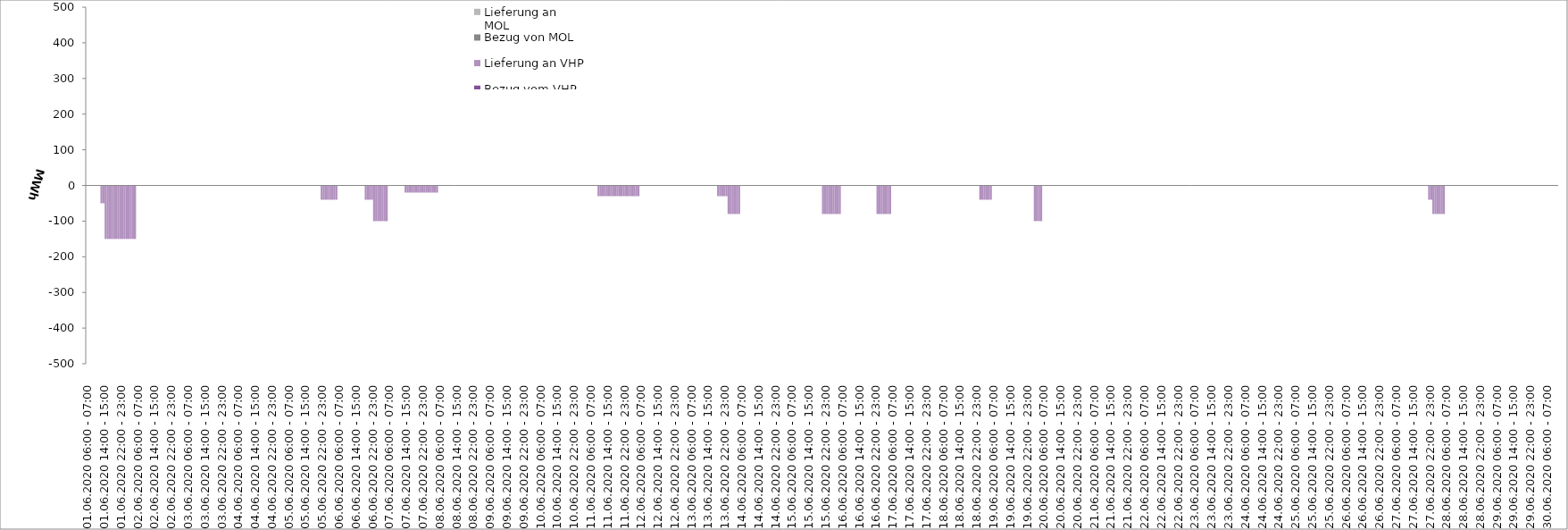
| Category | Bezug vom VHP | Lieferung an VHP | Bezug von MOL | Lieferung an MOL |
|---|---|---|---|---|
| 01.06.2020 06:00 - 07:00 | 0 | 0 | 0 | 0 |
| 01.06.2020 07:00 - 08:00 | 0 | 0 | 0 | 0 |
| 01.06.2020 08:00 - 09:00 | 0 | 0 | 0 | 0 |
| 01.06.2020 09:00 - 10:00 | 0 | 0 | 0 | 0 |
| 01.06.2020 10:00 - 11:00 | 0 | 0 | 0 | 0 |
| 01.06.2020 11:00 - 12:00 | 0 | 0 | 0 | 0 |
| 01.06.2020 12:00 - 13:00 | 0 | 0 | 0 | 0 |
| 01.06.2020 13:00 - 14:00 | 0 | -50 | 0 | 0 |
| 01.06.2020 14:00 - 15:00 | 0 | -50 | 0 | 0 |
| 01.06.2020 15:00 - 16:00 | 0 | -150 | 0 | 0 |
| 01.06.2020 16:00 - 17:00 | 0 | -150 | 0 | 0 |
| 01.06.2020 17:00 - 18:00 | 0 | -150 | 0 | 0 |
| 01.06.2020 18:00 - 19:00 | 0 | -150 | 0 | 0 |
| 01.06.2020 19:00 - 20:00 | 0 | -150 | 0 | 0 |
| 01.06.2020 20:00 - 21:00 | 0 | -150 | 0 | 0 |
| 01.06.2020 21:00 - 22:00 | 0 | -150 | 0 | 0 |
| 01.06.2020 22:00 - 23:00 | 0 | -150 | 0 | 0 |
| 01.06.2020 23:00 - 24:00 | 0 | -150 | 0 | 0 |
| 02.06.2020 00:00 - 01:00 | 0 | -150 | 0 | 0 |
| 02.06.2020 01:00 - 02:00 | 0 | -150 | 0 | 0 |
| 02.06.2020 02:00 - 03:00 | 0 | -150 | 0 | 0 |
| 02.06.2020 03:00 - 04:00 | 0 | -150 | 0 | 0 |
| 02.06.2020 04:00 - 05:00 | 0 | -150 | 0 | 0 |
| 02.06.2020 05:00 - 06:00 | 0 | -150 | 0 | 0 |
| 02.06.2020 06:00 - 07:00 | 0 | 0 | 0 | 0 |
| 02.06.2020 07:00 - 08:00 | 0 | 0 | 0 | 0 |
| 02.06.2020 08:00 - 09:00 | 0 | 0 | 0 | 0 |
| 02.06.2020 09:00 - 10:00 | 0 | 0 | 0 | 0 |
| 02.06.2020 10:00 - 11:00 | 0 | 0 | 0 | 0 |
| 02.06.2020 11:00 - 12:00 | 0 | 0 | 0 | 0 |
| 02.06.2020 12:00 - 13:00 | 0 | 0 | 0 | 0 |
| 02.06.2020 13:00 - 14:00 | 0 | 0 | 0 | 0 |
| 02.06.2020 14:00 - 15:00 | 0 | 0 | 0 | 0 |
| 02.06.2020 15:00 - 16:00 | 0 | 0 | 0 | 0 |
| 02.06.2020 16:00 - 17:00 | 0 | 0 | 0 | 0 |
| 02.06.2020 17:00 - 18:00 | 0 | 0 | 0 | 0 |
| 02.06.2020 18:00 - 19:00 | 0 | 0 | 0 | 0 |
| 02.06.2020 19:00 - 20:00 | 0 | 0 | 0 | 0 |
| 02.06.2020 20:00 - 21:00 | 0 | 0 | 0 | 0 |
| 02.06.2020 21:00 - 22:00 | 0 | 0 | 0 | 0 |
| 02.06.2020 22:00 - 23:00 | 0 | 0 | 0 | 0 |
| 02.06.2020 23:00 - 24:00 | 0 | 0 | 0 | 0 |
| 03.06.2020 00:00 - 01:00 | 0 | 0 | 0 | 0 |
| 03.06.2020 01:00 - 02:00 | 0 | 0 | 0 | 0 |
| 03.06.2020 02:00 - 03:00 | 0 | 0 | 0 | 0 |
| 03.06.2020 03:00 - 04:00 | 0 | 0 | 0 | 0 |
| 03.06.2020 04:00 - 05:00 | 0 | 0 | 0 | 0 |
| 03.06.2020 05:00 - 06:00 | 0 | 0 | 0 | 0 |
| 03.06.2020 06:00 - 07:00 | 0 | 0 | 0 | 0 |
| 03.06.2020 07:00 - 08:00 | 0 | 0 | 0 | 0 |
| 03.06.2020 08:00 - 09:00 | 0 | 0 | 0 | 0 |
| 03.06.2020 09:00 - 10:00 | 0 | 0 | 0 | 0 |
| 03.06.2020 10:00 - 11:00 | 0 | 0 | 0 | 0 |
| 03.06.2020 11:00 - 12:00 | 0 | 0 | 0 | 0 |
| 03.06.2020 12:00 - 13:00 | 0 | 0 | 0 | 0 |
| 03.06.2020 13:00 - 14:00 | 0 | 0 | 0 | 0 |
| 03.06.2020 14:00 - 15:00 | 0 | 0 | 0 | 0 |
| 03.06.2020 15:00 - 16:00 | 0 | 0 | 0 | 0 |
| 03.06.2020 16:00 - 17:00 | 0 | 0 | 0 | 0 |
| 03.06.2020 17:00 - 18:00 | 0 | 0 | 0 | 0 |
| 03.06.2020 18:00 - 19:00 | 0 | 0 | 0 | 0 |
| 03.06.2020 19:00 - 20:00 | 0 | 0 | 0 | 0 |
| 03.06.2020 20:00 - 21:00 | 0 | 0 | 0 | 0 |
| 03.06.2020 21:00 - 22:00 | 0 | 0 | 0 | 0 |
| 03.06.2020 22:00 - 23:00 | 0 | 0 | 0 | 0 |
| 03.06.2020 23:00 - 24:00 | 0 | 0 | 0 | 0 |
| 04.06.2020 00:00 - 01:00 | 0 | 0 | 0 | 0 |
| 04.06.2020 01:00 - 02:00 | 0 | 0 | 0 | 0 |
| 04.06.2020 02:00 - 03:00 | 0 | 0 | 0 | 0 |
| 04.06.2020 03:00 - 04:00 | 0 | 0 | 0 | 0 |
| 04.06.2020 04:00 - 05:00 | 0 | 0 | 0 | 0 |
| 04.06.2020 05:00 - 06:00 | 0 | 0 | 0 | 0 |
| 04.06.2020 06:00 - 07:00 | 0 | 0 | 0 | 0 |
| 04.06.2020 07:00 - 08:00 | 0 | 0 | 0 | 0 |
| 04.06.2020 08:00 - 09:00 | 0 | 0 | 0 | 0 |
| 04.06.2020 09:00 - 10:00 | 0 | 0 | 0 | 0 |
| 04.06.2020 10:00 - 11:00 | 0 | 0 | 0 | 0 |
| 04.06.2020 11:00 - 12:00 | 0 | 0 | 0 | 0 |
| 04.06.2020 12:00 - 13:00 | 0 | 0 | 0 | 0 |
| 04.06.2020 13:00 - 14:00 | 0 | 0 | 0 | 0 |
| 04.06.2020 14:00 - 15:00 | 0 | 0 | 0 | 0 |
| 04.06.2020 15:00 - 16:00 | 0 | 0 | 0 | 0 |
| 04.06.2020 16:00 - 17:00 | 0 | 0 | 0 | 0 |
| 04.06.2020 17:00 - 18:00 | 0 | 0 | 0 | 0 |
| 04.06.2020 18:00 - 19:00 | 0 | 0 | 0 | 0 |
| 04.06.2020 19:00 - 20:00 | 0 | 0 | 0 | 0 |
| 04.06.2020 20:00 - 21:00 | 0 | 0 | 0 | 0 |
| 04.06.2020 21:00 - 22:00 | 0 | 0 | 0 | 0 |
| 04.06.2020 22:00 - 23:00 | 0 | 0 | 0 | 0 |
| 04.06.2020 23:00 - 24:00 | 0 | 0 | 0 | 0 |
| 05.06.2020 00:00 - 01:00 | 0 | 0 | 0 | 0 |
| 05.06.2020 01:00 - 02:00 | 0 | 0 | 0 | 0 |
| 05.06.2020 02:00 - 03:00 | 0 | 0 | 0 | 0 |
| 05.06.2020 03:00 - 04:00 | 0 | 0 | 0 | 0 |
| 05.06.2020 04:00 - 05:00 | 0 | 0 | 0 | 0 |
| 05.06.2020 05:00 - 06:00 | 0 | 0 | 0 | 0 |
| 05.06.2020 06:00 - 07:00 | 0 | 0 | 0 | 0 |
| 05.06.2020 07:00 - 08:00 | 0 | 0 | 0 | 0 |
| 05.06.2020 08:00 - 09:00 | 0 | 0 | 0 | 0 |
| 05.06.2020 09:00 - 10:00 | 0 | 0 | 0 | 0 |
| 05.06.2020 10:00 - 11:00 | 0 | 0 | 0 | 0 |
| 05.06.2020 11:00 - 12:00 | 0 | 0 | 0 | 0 |
| 05.06.2020 12:00 - 13:00 | 0 | 0 | 0 | 0 |
| 05.06.2020 13:00 - 14:00 | 0 | 0 | 0 | 0 |
| 05.06.2020 14:00 - 15:00 | 0 | 0 | 0 | 0 |
| 05.06.2020 15:00 - 16:00 | 0 | 0 | 0 | 0 |
| 05.06.2020 16:00 - 17:00 | 0 | 0 | 0 | 0 |
| 05.06.2020 17:00 - 18:00 | 0 | 0 | 0 | 0 |
| 05.06.2020 18:00 - 19:00 | 0 | 0 | 0 | 0 |
| 05.06.2020 19:00 - 20:00 | 0 | 0 | 0 | 0 |
| 05.06.2020 20:00 - 21:00 | 0 | 0 | 0 | 0 |
| 05.06.2020 21:00 - 22:00 | 0 | 0 | 0 | 0 |
| 05.06.2020 22:00 - 23:00 | 0 | -40 | 0 | 0 |
| 05.06.2020 23:00 - 24:00 | 0 | -40 | 0 | 0 |
| 06.06.2020 00:00 - 01:00 | 0 | -40 | 0 | 0 |
| 06.06.2020 01:00 - 02:00 | 0 | -40 | 0 | 0 |
| 06.06.2020 02:00 - 03:00 | 0 | -40 | 0 | 0 |
| 06.06.2020 03:00 - 04:00 | 0 | -40 | 0 | 0 |
| 06.06.2020 04:00 - 05:00 | 0 | -40 | 0 | 0 |
| 06.06.2020 05:00 - 06:00 | 0 | -40 | 0 | 0 |
| 06.06.2020 06:00 - 07:00 | 0 | 0 | 0 | 0 |
| 06.06.2020 07:00 - 08:00 | 0 | 0 | 0 | 0 |
| 06.06.2020 08:00 - 09:00 | 0 | 0 | 0 | 0 |
| 06.06.2020 09:00 - 10:00 | 0 | 0 | 0 | 0 |
| 06.06.2020 10:00 - 11:00 | 0 | 0 | 0 | 0 |
| 06.06.2020 11:00 - 12:00 | 0 | 0 | 0 | 0 |
| 06.06.2020 12:00 - 13:00 | 0 | 0 | 0 | 0 |
| 06.06.2020 13:00 - 14:00 | 0 | 0 | 0 | 0 |
| 06.06.2020 14:00 - 15:00 | 0 | 0 | 0 | 0 |
| 06.06.2020 15:00 - 16:00 | 0 | 0 | 0 | 0 |
| 06.06.2020 16:00 - 17:00 | 0 | 0 | 0 | 0 |
| 06.06.2020 17:00 - 18:00 | 0 | 0 | 0 | 0 |
| 06.06.2020 18:00 - 19:00 | 0 | 0 | 0 | 0 |
| 06.06.2020 19:00 - 20:00 | 0 | -40 | 0 | 0 |
| 06.06.2020 20:00 - 21:00 | 0 | -40 | 0 | 0 |
| 06.06.2020 21:00 - 22:00 | 0 | -40 | 0 | 0 |
| 06.06.2020 22:00 - 23:00 | 0 | -40 | 0 | 0 |
| 06.06.2020 23:00 - 24:00 | 0 | -100 | 0 | 0 |
| 07.06.2020 00:00 - 01:00 | 0 | -100 | 0 | 0 |
| 07.06.2020 01:00 - 02:00 | 0 | -100 | 0 | 0 |
| 07.06.2020 02:00 - 03:00 | 0 | -100 | 0 | 0 |
| 07.06.2020 03:00 - 04:00 | 0 | -100 | 0 | 0 |
| 07.06.2020 04:00 - 05:00 | 0 | -100 | 0 | 0 |
| 07.06.2020 05:00 - 06:00 | 0 | -100 | 0 | 0 |
| 07.06.2020 06:00 - 07:00 | 0 | 0 | 0 | 0 |
| 07.06.2020 07:00 - 08:00 | 0 | 0 | 0 | 0 |
| 07.06.2020 08:00 - 09:00 | 0 | 0 | 0 | 0 |
| 07.06.2020 09:00 - 10:00 | 0 | 0 | 0 | 0 |
| 07.06.2020 10:00 - 11:00 | 0 | 0 | 0 | 0 |
| 07.06.2020 11:00 - 12:00 | 0 | 0 | 0 | 0 |
| 07.06.2020 12:00 - 13:00 | 0 | 0 | 0 | 0 |
| 07.06.2020 13:00 - 14:00 | 0 | 0 | 0 | 0 |
| 07.06.2020 14:00 - 15:00 | 0 | -20 | 0 | 0 |
| 07.06.2020 15:00 - 16:00 | 0 | -20 | 0 | 0 |
| 07.06.2020 16:00 - 17:00 | 0 | -20 | 0 | 0 |
| 07.06.2020 17:00 - 18:00 | 0 | -20 | 0 | 0 |
| 07.06.2020 18:00 - 19:00 | 0 | -20 | 0 | 0 |
| 07.06.2020 19:00 - 20:00 | 0 | -20 | 0 | 0 |
| 07.06.2020 20:00 - 21:00 | 0 | -20 | 0 | 0 |
| 07.06.2020 21:00 - 22:00 | 0 | -20 | 0 | 0 |
| 07.06.2020 22:00 - 23:00 | 0 | -20 | 0 | 0 |
| 07.06.2020 23:00 - 24:00 | 0 | -20 | 0 | 0 |
| 08.06.2020 00:00 - 01:00 | 0 | -20 | 0 | 0 |
| 08.06.2020 01:00 - 02:00 | 0 | -20 | 0 | 0 |
| 08.06.2020 02:00 - 03:00 | 0 | -20 | 0 | 0 |
| 08.06.2020 03:00 - 04:00 | 0 | -20 | 0 | 0 |
| 08.06.2020 04:00 - 05:00 | 0 | -20 | 0 | 0 |
| 08.06.2020 05:00 - 06:00 | 0 | -20 | 0 | 0 |
| 08.06.2020 06:00 - 07:00 | 0 | 0 | 0 | 0 |
| 08.06.2020 07:00 - 08:00 | 0 | 0 | 0 | 0 |
| 08.06.2020 08:00 - 09:00 | 0 | 0 | 0 | 0 |
| 08.06.2020 09:00 - 10:00 | 0 | 0 | 0 | 0 |
| 08.06.2020 10:00 - 11:00 | 0 | 0 | 0 | 0 |
| 08.06.2020 11:00 - 12:00 | 0 | 0 | 0 | 0 |
| 08.06.2020 12:00 - 13:00 | 0 | 0 | 0 | 0 |
| 08.06.2020 13:00 - 14:00 | 0 | 0 | 0 | 0 |
| 08.06.2020 14:00 - 15:00 | 0 | 0 | 0 | 0 |
| 08.06.2020 15:00 - 16:00 | 0 | 0 | 0 | 0 |
| 08.06.2020 16:00 - 17:00 | 0 | 0 | 0 | 0 |
| 08.06.2020 17:00 - 18:00 | 0 | 0 | 0 | 0 |
| 08.06.2020 18:00 - 19:00 | 0 | 0 | 0 | 0 |
| 08.06.2020 19:00 - 20:00 | 0 | 0 | 0 | 0 |
| 08.06.2020 20:00 - 21:00 | 0 | 0 | 0 | 0 |
| 08.06.2020 21:00 - 22:00 | 0 | 0 | 0 | 0 |
| 08.06.2020 22:00 - 23:00 | 0 | 0 | 0 | 0 |
| 08.06.2020 23:00 - 24:00 | 0 | 0 | 0 | 0 |
| 09.06.2020 00:00 - 01:00 | 0 | 0 | 0 | 0 |
| 09.06.2020 01:00 - 02:00 | 0 | 0 | 0 | 0 |
| 09.06.2020 02:00 - 03:00 | 0 | 0 | 0 | 0 |
| 09.06.2020 03:00 - 04:00 | 0 | 0 | 0 | 0 |
| 09.06.2020 04:00 - 05:00 | 0 | 0 | 0 | 0 |
| 09.06.2020 05:00 - 06:00 | 0 | 0 | 0 | 0 |
| 09.06.2020 06:00 - 07:00 | 0 | 0 | 0 | 0 |
| 09.06.2020 07:00 - 08:00 | 0 | 0 | 0 | 0 |
| 09.06.2020 08:00 - 09:00 | 0 | 0 | 0 | 0 |
| 09.06.2020 09:00 - 10:00 | 0 | 0 | 0 | 0 |
| 09.06.2020 10:00 - 11:00 | 0 | 0 | 0 | 0 |
| 09.06.2020 11:00 - 12:00 | 0 | 0 | 0 | 0 |
| 09.06.2020 12:00 - 13:00 | 0 | 0 | 0 | 0 |
| 09.06.2020 13:00 - 14:00 | 0 | 0 | 0 | 0 |
| 09.06.2020 14:00 - 15:00 | 0 | 0 | 0 | 0 |
| 09.06.2020 15:00 - 16:00 | 0 | 0 | 0 | 0 |
| 09.06.2020 16:00 - 17:00 | 0 | 0 | 0 | 0 |
| 09.06.2020 17:00 - 18:00 | 0 | 0 | 0 | 0 |
| 09.06.2020 18:00 - 19:00 | 0 | 0 | 0 | 0 |
| 09.06.2020 19:00 - 20:00 | 0 | 0 | 0 | 0 |
| 09.06.2020 20:00 - 21:00 | 0 | 0 | 0 | 0 |
| 09.06.2020 21:00 - 22:00 | 0 | 0 | 0 | 0 |
| 09.06.2020 22:00 - 23:00 | 0 | 0 | 0 | 0 |
| 09.06.2020 23:00 - 24:00 | 0 | 0 | 0 | 0 |
| 10.06.2020 00:00 - 01:00 | 0 | 0 | 0 | 0 |
| 10.06.2020 01:00 - 02:00 | 0 | 0 | 0 | 0 |
| 10.06.2020 02:00 - 03:00 | 0 | 0 | 0 | 0 |
| 10.06.2020 03:00 - 04:00 | 0 | 0 | 0 | 0 |
| 10.06.2020 04:00 - 05:00 | 0 | 0 | 0 | 0 |
| 10.06.2020 05:00 - 06:00 | 0 | 0 | 0 | 0 |
| 10.06.2020 06:00 - 07:00 | 0 | 0 | 0 | 0 |
| 10.06.2020 07:00 - 08:00 | 0 | 0 | 0 | 0 |
| 10.06.2020 08:00 - 09:00 | 0 | 0 | 0 | 0 |
| 10.06.2020 09:00 - 10:00 | 0 | 0 | 0 | 0 |
| 10.06.2020 10:00 - 11:00 | 0 | 0 | 0 | 0 |
| 10.06.2020 11:00 - 12:00 | 0 | 0 | 0 | 0 |
| 10.06.2020 12:00 - 13:00 | 0 | 0 | 0 | 0 |
| 10.06.2020 13:00 - 14:00 | 0 | 0 | 0 | 0 |
| 10.06.2020 14:00 - 15:00 | 0 | 0 | 0 | 0 |
| 10.06.2020 15:00 - 16:00 | 0 | 0 | 0 | 0 |
| 10.06.2020 16:00 - 17:00 | 0 | 0 | 0 | 0 |
| 10.06.2020 17:00 - 18:00 | 0 | 0 | 0 | 0 |
| 10.06.2020 18:00 - 19:00 | 0 | 0 | 0 | 0 |
| 10.06.2020 19:00 - 20:00 | 0 | 0 | 0 | 0 |
| 10.06.2020 20:00 - 21:00 | 0 | 0 | 0 | 0 |
| 10.06.2020 21:00 - 22:00 | 0 | 0 | 0 | 0 |
| 10.06.2020 22:00 - 23:00 | 0 | 0 | 0 | 0 |
| 10.06.2020 23:00 - 24:00 | 0 | 0 | 0 | 0 |
| 11.06.2020 00:00 - 01:00 | 0 | 0 | 0 | 0 |
| 11.06.2020 01:00 - 02:00 | 0 | 0 | 0 | 0 |
| 11.06.2020 02:00 - 03:00 | 0 | 0 | 0 | 0 |
| 11.06.2020 03:00 - 04:00 | 0 | 0 | 0 | 0 |
| 11.06.2020 04:00 - 05:00 | 0 | 0 | 0 | 0 |
| 11.06.2020 05:00 - 06:00 | 0 | 0 | 0 | 0 |
| 11.06.2020 06:00 - 07:00 | 0 | 0 | 0 | 0 |
| 11.06.2020 07:00 - 08:00 | 0 | 0 | 0 | 0 |
| 11.06.2020 08:00 - 09:00 | 0 | 0 | 0 | 0 |
| 11.06.2020 09:00 - 10:00 | 0 | 0 | 0 | 0 |
| 11.06.2020 10:00 - 11:00 | 0 | -30 | 0 | 0 |
| 11.06.2020 11:00 - 12:00 | 0 | -30 | 0 | 0 |
| 11.06.2020 12:00 - 13:00 | 0 | -30 | 0 | 0 |
| 11.06.2020 13:00 - 14:00 | 0 | -30 | 0 | 0 |
| 11.06.2020 14:00 - 15:00 | 0 | -30 | 0 | 0 |
| 11.06.2020 15:00 - 16:00 | 0 | -30 | 0 | 0 |
| 11.06.2020 16:00 - 17:00 | 0 | -30 | 0 | 0 |
| 11.06.2020 17:00 - 18:00 | 0 | -30 | 0 | 0 |
| 11.06.2020 18:00 - 19:00 | 0 | -30 | 0 | 0 |
| 11.06.2020 19:00 - 20:00 | 0 | -30 | 0 | 0 |
| 11.06.2020 20:00 - 21:00 | 0 | -30 | 0 | 0 |
| 11.06.2020 21:00 - 22:00 | 0 | -30 | 0 | 0 |
| 11.06.2020 22:00 - 23:00 | 0 | -30 | 0 | 0 |
| 11.06.2020 23:00 - 24:00 | 0 | -30 | 0 | 0 |
| 12.06.2020 00:00 - 01:00 | 0 | -30 | 0 | 0 |
| 12.06.2020 01:00 - 02:00 | 0 | -30 | 0 | 0 |
| 12.06.2020 02:00 - 03:00 | 0 | -30 | 0 | 0 |
| 12.06.2020 03:00 - 04:00 | 0 | -30 | 0 | 0 |
| 12.06.2020 04:00 - 05:00 | 0 | -30 | 0 | 0 |
| 12.06.2020 05:00 - 06:00 | 0 | -30 | 0 | 0 |
| 12.06.2020 06:00 - 07:00 | 0 | 0 | 0 | 0 |
| 12.06.2020 07:00 - 08:00 | 0 | 0 | 0 | 0 |
| 12.06.2020 08:00 - 09:00 | 0 | 0 | 0 | 0 |
| 12.06.2020 09:00 - 10:00 | 0 | 0 | 0 | 0 |
| 12.06.2020 10:00 - 11:00 | 0 | 0 | 0 | 0 |
| 12.06.2020 11:00 - 12:00 | 0 | 0 | 0 | 0 |
| 12.06.2020 12:00 - 13:00 | 0 | 0 | 0 | 0 |
| 12.06.2020 13:00 - 14:00 | 0 | 0 | 0 | 0 |
| 12.06.2020 14:00 - 15:00 | 0 | 0 | 0 | 0 |
| 12.06.2020 15:00 - 16:00 | 0 | 0 | 0 | 0 |
| 12.06.2020 16:00 - 17:00 | 0 | 0 | 0 | 0 |
| 12.06.2020 17:00 - 18:00 | 0 | 0 | 0 | 0 |
| 12.06.2020 18:00 - 19:00 | 0 | 0 | 0 | 0 |
| 12.06.2020 19:00 - 20:00 | 0 | 0 | 0 | 0 |
| 12.06.2020 20:00 - 21:00 | 0 | 0 | 0 | 0 |
| 12.06.2020 21:00 - 22:00 | 0 | 0 | 0 | 0 |
| 12.06.2020 22:00 - 23:00 | 0 | 0 | 0 | 0 |
| 12.06.2020 23:00 - 24:00 | 0 | 0 | 0 | 0 |
| 13.06.2020 00:00 - 01:00 | 0 | 0 | 0 | 0 |
| 13.06.2020 01:00 - 02:00 | 0 | 0 | 0 | 0 |
| 13.06.2020 02:00 - 03:00 | 0 | 0 | 0 | 0 |
| 13.06.2020 03:00 - 04:00 | 0 | 0 | 0 | 0 |
| 13.06.2020 04:00 - 05:00 | 0 | 0 | 0 | 0 |
| 13.06.2020 05:00 - 06:00 | 0 | 0 | 0 | 0 |
| 13.06.2020 06:00 - 07:00 | 0 | 0 | 0 | 0 |
| 13.06.2020 07:00 - 08:00 | 0 | 0 | 0 | 0 |
| 13.06.2020 08:00 - 09:00 | 0 | 0 | 0 | 0 |
| 13.06.2020 09:00 - 10:00 | 0 | 0 | 0 | 0 |
| 13.06.2020 10:00 - 11:00 | 0 | 0 | 0 | 0 |
| 13.06.2020 11:00 - 12:00 | 0 | 0 | 0 | 0 |
| 13.06.2020 12:00 - 13:00 | 0 | 0 | 0 | 0 |
| 13.06.2020 13:00 - 14:00 | 0 | 0 | 0 | 0 |
| 13.06.2020 14:00 - 15:00 | 0 | 0 | 0 | 0 |
| 13.06.2020 15:00 - 16:00 | 0 | 0 | 0 | 0 |
| 13.06.2020 16:00 - 17:00 | 0 | 0 | 0 | 0 |
| 13.06.2020 17:00 - 18:00 | 0 | 0 | 0 | 0 |
| 13.06.2020 18:00 - 19:00 | 0 | 0 | 0 | 0 |
| 13.06.2020 19:00 - 20:00 | 0 | -30 | 0 | 0 |
| 13.06.2020 20:00 - 21:00 | 0 | -30 | 0 | 0 |
| 13.06.2020 21:00 - 22:00 | 0 | -30 | 0 | 0 |
| 13.06.2020 22:00 - 23:00 | 0 | -30 | 0 | 0 |
| 13.06.2020 23:00 - 24:00 | 0 | -30 | 0 | 0 |
| 14.06.2020 00:00 - 01:00 | 0 | -80 | 0 | 0 |
| 14.06.2020 01:00 - 02:00 | 0 | -80 | 0 | 0 |
| 14.06.2020 02:00 - 03:00 | 0 | -80 | 0 | 0 |
| 14.06.2020 03:00 - 04:00 | 0 | -80 | 0 | 0 |
| 14.06.2020 04:00 - 05:00 | 0 | -80 | 0 | 0 |
| 14.06.2020 05:00 - 06:00 | 0 | -80 | 0 | 0 |
| 14.06.2020 06:00 - 07:00 | 0 | 0 | 0 | 0 |
| 14.06.2020 07:00 - 08:00 | 0 | 0 | 0 | 0 |
| 14.06.2020 08:00 - 09:00 | 0 | 0 | 0 | 0 |
| 14.06.2020 09:00 - 10:00 | 0 | 0 | 0 | 0 |
| 14.06.2020 10:00 - 11:00 | 0 | 0 | 0 | 0 |
| 14.06.2020 11:00 - 12:00 | 0 | 0 | 0 | 0 |
| 14.06.2020 12:00 - 13:00 | 0 | 0 | 0 | 0 |
| 14.06.2020 13:00 - 14:00 | 0 | 0 | 0 | 0 |
| 14.06.2020 14:00 - 15:00 | 0 | 0 | 0 | 0 |
| 14.06.2020 15:00 - 16:00 | 0 | 0 | 0 | 0 |
| 14.06.2020 16:00 - 17:00 | 0 | 0 | 0 | 0 |
| 14.06.2020 17:00 - 18:00 | 0 | 0 | 0 | 0 |
| 14.06.2020 18:00 - 19:00 | 0 | 0 | 0 | 0 |
| 14.06.2020 19:00 - 20:00 | 0 | 0 | 0 | 0 |
| 14.06.2020 20:00 - 21:00 | 0 | 0 | 0 | 0 |
| 14.06.2020 21:00 - 22:00 | 0 | 0 | 0 | 0 |
| 14.06.2020 22:00 - 23:00 | 0 | 0 | 0 | 0 |
| 14.06.2020 23:00 - 24:00 | 0 | 0 | 0 | 0 |
| 15.06.2020 00:00 - 01:00 | 0 | 0 | 0 | 0 |
| 15.06.2020 01:00 - 02:00 | 0 | 0 | 0 | 0 |
| 15.06.2020 02:00 - 03:00 | 0 | 0 | 0 | 0 |
| 15.06.2020 03:00 - 04:00 | 0 | 0 | 0 | 0 |
| 15.06.2020 04:00 - 05:00 | 0 | 0 | 0 | 0 |
| 15.06.2020 05:00 - 06:00 | 0 | 0 | 0 | 0 |
| 15.06.2020 06:00 - 07:00 | 0 | 0 | 0 | 0 |
| 15.06.2020 07:00 - 08:00 | 0 | 0 | 0 | 0 |
| 15.06.2020 08:00 - 09:00 | 0 | 0 | 0 | 0 |
| 15.06.2020 09:00 - 10:00 | 0 | 0 | 0 | 0 |
| 15.06.2020 10:00 - 11:00 | 0 | 0 | 0 | 0 |
| 15.06.2020 11:00 - 12:00 | 0 | 0 | 0 | 0 |
| 15.06.2020 12:00 - 13:00 | 0 | 0 | 0 | 0 |
| 15.06.2020 13:00 - 14:00 | 0 | 0 | 0 | 0 |
| 15.06.2020 14:00 - 15:00 | 0 | 0 | 0 | 0 |
| 15.06.2020 15:00 - 16:00 | 0 | 0 | 0 | 0 |
| 15.06.2020 16:00 - 17:00 | 0 | 0 | 0 | 0 |
| 15.06.2020 17:00 - 18:00 | 0 | 0 | 0 | 0 |
| 15.06.2020 18:00 - 19:00 | 0 | 0 | 0 | 0 |
| 15.06.2020 19:00 - 20:00 | 0 | 0 | 0 | 0 |
| 15.06.2020 20:00 - 21:00 | 0 | 0 | 0 | 0 |
| 15.06.2020 21:00 - 22:00 | 0 | -80 | 0 | 0 |
| 15.06.2020 22:00 - 23:00 | 0 | -80 | 0 | 0 |
| 15.06.2020 23:00 - 24:00 | 0 | -80 | 0 | 0 |
| 16.06.2020 00:00 - 01:00 | 0 | -80 | 0 | 0 |
| 16.06.2020 01:00 - 02:00 | 0 | -80 | 0 | 0 |
| 16.06.2020 02:00 - 03:00 | 0 | -80 | 0 | 0 |
| 16.06.2020 03:00 - 04:00 | 0 | -80 | 0 | 0 |
| 16.06.2020 04:00 - 05:00 | 0 | -80 | 0 | 0 |
| 16.06.2020 05:00 - 06:00 | 0 | -80 | 0 | 0 |
| 16.06.2020 06:00 - 07:00 | 0 | 0 | 0 | 0 |
| 16.06.2020 07:00 - 08:00 | 0 | 0 | 0 | 0 |
| 16.06.2020 08:00 - 09:00 | 0 | 0 | 0 | 0 |
| 16.06.2020 09:00 - 10:00 | 0 | 0 | 0 | 0 |
| 16.06.2020 10:00 - 11:00 | 0 | 0 | 0 | 0 |
| 16.06.2020 11:00 - 12:00 | 0 | 0 | 0 | 0 |
| 16.06.2020 12:00 - 13:00 | 0 | 0 | 0 | 0 |
| 16.06.2020 13:00 - 14:00 | 0 | 0 | 0 | 0 |
| 16.06.2020 14:00 - 15:00 | 0 | 0 | 0 | 0 |
| 16.06.2020 15:00 - 16:00 | 0 | 0 | 0 | 0 |
| 16.06.2020 16:00 - 17:00 | 0 | 0 | 0 | 0 |
| 16.06.2020 17:00 - 18:00 | 0 | 0 | 0 | 0 |
| 16.06.2020 18:00 - 19:00 | 0 | 0 | 0 | 0 |
| 16.06.2020 19:00 - 20:00 | 0 | 0 | 0 | 0 |
| 16.06.2020 20:00 - 21:00 | 0 | 0 | 0 | 0 |
| 16.06.2020 21:00 - 22:00 | 0 | 0 | 0 | 0 |
| 16.06.2020 22:00 - 23:00 | 0 | 0 | 0 | 0 |
| 16.06.2020 23:00 - 24:00 | 0 | -80 | 0 | 0 |
| 17.06.2020 00:00 - 01:00 | 0 | -80 | 0 | 0 |
| 17.06.2020 01:00 - 02:00 | 0 | -80 | 0 | 0 |
| 17.06.2020 02:00 - 03:00 | 0 | -80 | 0 | 0 |
| 17.06.2020 03:00 - 04:00 | 0 | -80 | 0 | 0 |
| 17.06.2020 04:00 - 05:00 | 0 | -80 | 0 | 0 |
| 17.06.2020 05:00 - 06:00 | 0 | -80 | 0 | 0 |
| 17.06.2020 06:00 - 07:00 | 0 | 0 | 0 | 0 |
| 17.06.2020 07:00 - 08:00 | 0 | 0 | 0 | 0 |
| 17.06.2020 08:00 - 09:00 | 0 | 0 | 0 | 0 |
| 17.06.2020 09:00 - 10:00 | 0 | 0 | 0 | 0 |
| 17.06.2020 10:00 - 11:00 | 0 | 0 | 0 | 0 |
| 17.06.2020 11:00 - 12:00 | 0 | 0 | 0 | 0 |
| 17.06.2020 12:00 - 13:00 | 0 | 0 | 0 | 0 |
| 17.06.2020 13:00 - 14:00 | 0 | 0 | 0 | 0 |
| 17.06.2020 14:00 - 15:00 | 0 | 0 | 0 | 0 |
| 17.06.2020 15:00 - 16:00 | 0 | 0 | 0 | 0 |
| 17.06.2020 16:00 - 17:00 | 0 | 0 | 0 | 0 |
| 17.06.2020 17:00 - 18:00 | 0 | 0 | 0 | 0 |
| 17.06.2020 18:00 - 19:00 | 0 | 0 | 0 | 0 |
| 17.06.2020 19:00 - 20:00 | 0 | 0 | 0 | 0 |
| 17.06.2020 20:00 - 21:00 | 0 | 0 | 0 | 0 |
| 17.06.2020 21:00 - 22:00 | 0 | 0 | 0 | 0 |
| 17.06.2020 22:00 - 23:00 | 0 | 0 | 0 | 0 |
| 17.06.2020 23:00 - 24:00 | 0 | 0 | 0 | 0 |
| 18.06.2020 00:00 - 01:00 | 0 | 0 | 0 | 0 |
| 18.06.2020 01:00 - 02:00 | 0 | 0 | 0 | 0 |
| 18.06.2020 02:00 - 03:00 | 0 | 0 | 0 | 0 |
| 18.06.2020 03:00 - 04:00 | 0 | 0 | 0 | 0 |
| 18.06.2020 04:00 - 05:00 | 0 | 0 | 0 | 0 |
| 18.06.2020 05:00 - 06:00 | 0 | 0 | 0 | 0 |
| 18.06.2020 06:00 - 07:00 | 0 | 0 | 0 | 0 |
| 18.06.2020 07:00 - 08:00 | 0 | 0 | 0 | 0 |
| 18.06.2020 08:00 - 09:00 | 0 | 0 | 0 | 0 |
| 18.06.2020 09:00 - 10:00 | 0 | 0 | 0 | 0 |
| 18.06.2020 10:00 - 11:00 | 0 | 0 | 0 | 0 |
| 18.06.2020 11:00 - 12:00 | 0 | 0 | 0 | 0 |
| 18.06.2020 12:00 - 13:00 | 0 | 0 | 0 | 0 |
| 18.06.2020 13:00 - 14:00 | 0 | 0 | 0 | 0 |
| 18.06.2020 14:00 - 15:00 | 0 | 0 | 0 | 0 |
| 18.06.2020 15:00 - 16:00 | 0 | 0 | 0 | 0 |
| 18.06.2020 16:00 - 17:00 | 0 | 0 | 0 | 0 |
| 18.06.2020 17:00 - 18:00 | 0 | 0 | 0 | 0 |
| 18.06.2020 18:00 - 19:00 | 0 | 0 | 0 | 0 |
| 18.06.2020 19:00 - 20:00 | 0 | 0 | 0 | 0 |
| 18.06.2020 20:00 - 21:00 | 0 | 0 | 0 | 0 |
| 18.06.2020 21:00 - 22:00 | 0 | 0 | 0 | 0 |
| 18.06.2020 22:00 - 23:00 | 0 | 0 | 0 | 0 |
| 18.06.2020 23:00 - 24:00 | 0 | 0 | 0 | 0 |
| 19.06.2020 00:00 - 01:00 | 0 | -40 | 0 | 0 |
| 19.06.2020 01:00 - 02:00 | 0 | -40 | 0 | 0 |
| 19.06.2020 02:00 - 03:00 | 0 | -40 | 0 | 0 |
| 19.06.2020 03:00 - 04:00 | 0 | -40 | 0 | 0 |
| 19.06.2020 04:00 - 05:00 | 0 | -40 | 0 | 0 |
| 19.06.2020 05:00 - 06:00 | 0 | -40 | 0 | 0 |
| 19.06.2020 06:00 - 07:00 | 0 | 0 | 0 | 0 |
| 19.06.2020 07:00 - 08:00 | 0 | 0 | 0 | 0 |
| 19.06.2020 08:00 - 09:00 | 0 | 0 | 0 | 0 |
| 19.06.2020 09:00 - 10:00 | 0 | 0 | 0 | 0 |
| 19.06.2020 10:00 - 11:00 | 0 | 0 | 0 | 0 |
| 19.06.2020 11:00 - 12:00 | 0 | 0 | 0 | 0 |
| 19.06.2020 12:00 - 13:00 | 0 | 0 | 0 | 0 |
| 19.06.2020 13:00 - 14:00 | 0 | 0 | 0 | 0 |
| 19.06.2020 14:00 - 15:00 | 0 | 0 | 0 | 0 |
| 19.06.2020 15:00 - 16:00 | 0 | 0 | 0 | 0 |
| 19.06.2020 16:00 - 17:00 | 0 | 0 | 0 | 0 |
| 19.06.2020 17:00 - 18:00 | 0 | 0 | 0 | 0 |
| 19.06.2020 18:00 - 19:00 | 0 | 0 | 0 | 0 |
| 19.06.2020 19:00 - 20:00 | 0 | 0 | 0 | 0 |
| 19.06.2020 20:00 - 21:00 | 0 | 0 | 0 | 0 |
| 19.06.2020 21:00 - 22:00 | 0 | 0 | 0 | 0 |
| 19.06.2020 22:00 - 23:00 | 0 | 0 | 0 | 0 |
| 19.06.2020 23:00 - 24:00 | 0 | 0 | 0 | 0 |
| 20.06.2020 00:00 - 01:00 | 0 | 0 | 0 | 0 |
| 20.06.2020 01:00 - 02:00 | 0 | 0 | 0 | 0 |
| 20.06.2020 02:00 - 03:00 | 0 | -100 | 0 | 0 |
| 20.06.2020 03:00 - 04:00 | 0 | -100 | 0 | 0 |
| 20.06.2020 04:00 - 05:00 | 0 | -100 | 0 | 0 |
| 20.06.2020 05:00 - 06:00 | 0 | -100 | 0 | 0 |
| 20.06.2020 06:00 - 07:00 | 0 | 0 | 0 | 0 |
| 20.06.2020 07:00 - 08:00 | 0 | 0 | 0 | 0 |
| 20.06.2020 08:00 - 09:00 | 0 | 0 | 0 | 0 |
| 20.06.2020 09:00 - 10:00 | 0 | 0 | 0 | 0 |
| 20.06.2020 10:00 - 11:00 | 0 | 0 | 0 | 0 |
| 20.06.2020 11:00 - 12:00 | 0 | 0 | 0 | 0 |
| 20.06.2020 12:00 - 13:00 | 0 | 0 | 0 | 0 |
| 20.06.2020 13:00 - 14:00 | 0 | 0 | 0 | 0 |
| 20.06.2020 14:00 - 15:00 | 0 | 0 | 0 | 0 |
| 20.06.2020 15:00 - 16:00 | 0 | 0 | 0 | 0 |
| 20.06.2020 16:00 - 17:00 | 0 | 0 | 0 | 0 |
| 20.06.2020 17:00 - 18:00 | 0 | 0 | 0 | 0 |
| 20.06.2020 18:00 - 19:00 | 0 | 0 | 0 | 0 |
| 20.06.2020 19:00 - 20:00 | 0 | 0 | 0 | 0 |
| 20.06.2020 20:00 - 21:00 | 0 | 0 | 0 | 0 |
| 20.06.2020 21:00 - 22:00 | 0 | 0 | 0 | 0 |
| 20.06.2020 22:00 - 23:00 | 0 | 0 | 0 | 0 |
| 20.06.2020 23:00 - 24:00 | 0 | 0 | 0 | 0 |
| 21.06.2020 00:00 - 01:00 | 0 | 0 | 0 | 0 |
| 21.06.2020 01:00 - 02:00 | 0 | 0 | 0 | 0 |
| 21.06.2020 02:00 - 03:00 | 0 | 0 | 0 | 0 |
| 21.06.2020 03:00 - 04:00 | 0 | 0 | 0 | 0 |
| 21.06.2020 04:00 - 05:00 | 0 | 0 | 0 | 0 |
| 21.06.2020 05:00 - 06:00 | 0 | 0 | 0 | 0 |
| 21.06.2020 06:00 - 07:00 | 0 | 0 | 0 | 0 |
| 21.06.2020 07:00 - 08:00 | 0 | 0 | 0 | 0 |
| 21.06.2020 08:00 - 09:00 | 0 | 0 | 0 | 0 |
| 21.06.2020 09:00 - 10:00 | 0 | 0 | 0 | 0 |
| 21.06.2020 10:00 - 11:00 | 0 | 0 | 0 | 0 |
| 21.06.2020 11:00 - 12:00 | 0 | 0 | 0 | 0 |
| 21.06.2020 12:00 - 13:00 | 0 | 0 | 0 | 0 |
| 21.06.2020 13:00 - 14:00 | 0 | 0 | 0 | 0 |
| 21.06.2020 14:00 - 15:00 | 0 | 0 | 0 | 0 |
| 21.06.2020 15:00 - 16:00 | 0 | 0 | 0 | 0 |
| 21.06.2020 16:00 - 17:00 | 0 | 0 | 0 | 0 |
| 21.06.2020 17:00 - 18:00 | 0 | 0 | 0 | 0 |
| 21.06.2020 18:00 - 19:00 | 0 | 0 | 0 | 0 |
| 21.06.2020 19:00 - 20:00 | 0 | 0 | 0 | 0 |
| 21.06.2020 20:00 - 21:00 | 0 | 0 | 0 | 0 |
| 21.06.2020 21:00 - 22:00 | 0 | 0 | 0 | 0 |
| 21.06.2020 22:00 - 23:00 | 0 | 0 | 0 | 0 |
| 21.06.2020 23:00 - 24:00 | 0 | 0 | 0 | 0 |
| 22.06.2020 00:00 - 01:00 | 0 | 0 | 0 | 0 |
| 22.06.2020 01:00 - 02:00 | 0 | 0 | 0 | 0 |
| 22.06.2020 02:00 - 03:00 | 0 | 0 | 0 | 0 |
| 22.06.2020 03:00 - 04:00 | 0 | 0 | 0 | 0 |
| 22.06.2020 04:00 - 05:00 | 0 | 0 | 0 | 0 |
| 22.06.2020 05:00 - 06:00 | 0 | 0 | 0 | 0 |
| 22.06.2020 06:00 - 07:00 | 0 | 0 | 0 | 0 |
| 22.06.2020 07:00 - 08:00 | 0 | 0 | 0 | 0 |
| 22.06.2020 08:00 - 09:00 | 0 | 0 | 0 | 0 |
| 22.06.2020 09:00 - 10:00 | 0 | 0 | 0 | 0 |
| 22.06.2020 10:00 - 11:00 | 0 | 0 | 0 | 0 |
| 22.06.2020 11:00 - 12:00 | 0 | 0 | 0 | 0 |
| 22.06.2020 12:00 - 13:00 | 0 | 0 | 0 | 0 |
| 22.06.2020 13:00 - 14:00 | 0 | 0 | 0 | 0 |
| 22.06.2020 14:00 - 15:00 | 0 | 0 | 0 | 0 |
| 22.06.2020 15:00 - 16:00 | 0 | 0 | 0 | 0 |
| 22.06.2020 16:00 - 17:00 | 0 | 0 | 0 | 0 |
| 22.06.2020 17:00 - 18:00 | 0 | 0 | 0 | 0 |
| 22.06.2020 18:00 - 19:00 | 0 | 0 | 0 | 0 |
| 22.06.2020 19:00 - 20:00 | 0 | 0 | 0 | 0 |
| 22.06.2020 20:00 - 21:00 | 0 | 0 | 0 | 0 |
| 22.06.2020 21:00 - 22:00 | 0 | 0 | 0 | 0 |
| 22.06.2020 22:00 - 23:00 | 0 | 0 | 0 | 0 |
| 22.06.2020 23:00 - 24:00 | 0 | 0 | 0 | 0 |
| 23.06.2020 00:00 - 01:00 | 0 | 0 | 0 | 0 |
| 23.06.2020 01:00 - 02:00 | 0 | 0 | 0 | 0 |
| 23.06.2020 02:00 - 03:00 | 0 | 0 | 0 | 0 |
| 23.06.2020 03:00 - 04:00 | 0 | 0 | 0 | 0 |
| 23.06.2020 04:00 - 05:00 | 0 | 0 | 0 | 0 |
| 23.06.2020 05:00 - 06:00 | 0 | 0 | 0 | 0 |
| 23.06.2020 06:00 - 07:00 | 0 | 0 | 0 | 0 |
| 23.06.2020 07:00 - 08:00 | 0 | 0 | 0 | 0 |
| 23.06.2020 08:00 - 09:00 | 0 | 0 | 0 | 0 |
| 23.06.2020 09:00 - 10:00 | 0 | 0 | 0 | 0 |
| 23.06.2020 10:00 - 11:00 | 0 | 0 | 0 | 0 |
| 23.06.2020 11:00 - 12:00 | 0 | 0 | 0 | 0 |
| 23.06.2020 12:00 - 13:00 | 0 | 0 | 0 | 0 |
| 23.06.2020 13:00 - 14:00 | 0 | 0 | 0 | 0 |
| 23.06.2020 14:00 - 15:00 | 0 | 0 | 0 | 0 |
| 23.06.2020 15:00 - 16:00 | 0 | 0 | 0 | 0 |
| 23.06.2020 16:00 - 17:00 | 0 | 0 | 0 | 0 |
| 23.06.2020 17:00 - 18:00 | 0 | 0 | 0 | 0 |
| 23.06.2020 18:00 - 19:00 | 0 | 0 | 0 | 0 |
| 23.06.2020 19:00 - 20:00 | 0 | 0 | 0 | 0 |
| 23.06.2020 20:00 - 21:00 | 0 | 0 | 0 | 0 |
| 23.06.2020 21:00 - 22:00 | 0 | 0 | 0 | 0 |
| 23.06.2020 22:00 - 23:00 | 0 | 0 | 0 | 0 |
| 23.06.2020 23:00 - 24:00 | 0 | 0 | 0 | 0 |
| 24.06.2020 00:00 - 01:00 | 0 | 0 | 0 | 0 |
| 24.06.2020 01:00 - 02:00 | 0 | 0 | 0 | 0 |
| 24.06.2020 02:00 - 03:00 | 0 | 0 | 0 | 0 |
| 24.06.2020 03:00 - 04:00 | 0 | 0 | 0 | 0 |
| 24.06.2020 04:00 - 05:00 | 0 | 0 | 0 | 0 |
| 24.06.2020 05:00 - 06:00 | 0 | 0 | 0 | 0 |
| 24.06.2020 06:00 - 07:00 | 0 | 0 | 0 | 0 |
| 24.06.2020 07:00 - 08:00 | 0 | 0 | 0 | 0 |
| 24.06.2020 08:00 - 09:00 | 0 | 0 | 0 | 0 |
| 24.06.2020 09:00 - 10:00 | 0 | 0 | 0 | 0 |
| 24.06.2020 10:00 - 11:00 | 0 | 0 | 0 | 0 |
| 24.06.2020 11:00 - 12:00 | 0 | 0 | 0 | 0 |
| 24.06.2020 12:00 - 13:00 | 0 | 0 | 0 | 0 |
| 24.06.2020 13:00 - 14:00 | 0 | 0 | 0 | 0 |
| 24.06.2020 14:00 - 15:00 | 0 | 0 | 0 | 0 |
| 24.06.2020 15:00 - 16:00 | 0 | 0 | 0 | 0 |
| 24.06.2020 16:00 - 17:00 | 0 | 0 | 0 | 0 |
| 24.06.2020 17:00 - 18:00 | 0 | 0 | 0 | 0 |
| 24.06.2020 18:00 - 19:00 | 0 | 0 | 0 | 0 |
| 24.06.2020 19:00 - 20:00 | 0 | 0 | 0 | 0 |
| 24.06.2020 20:00 - 21:00 | 0 | 0 | 0 | 0 |
| 24.06.2020 21:00 - 22:00 | 0 | 0 | 0 | 0 |
| 24.06.2020 22:00 - 23:00 | 0 | 0 | 0 | 0 |
| 24.06.2020 23:00 - 24:00 | 0 | 0 | 0 | 0 |
| 25.06.2020 00:00 - 01:00 | 0 | 0 | 0 | 0 |
| 25.06.2020 01:00 - 02:00 | 0 | 0 | 0 | 0 |
| 25.06.2020 02:00 - 03:00 | 0 | 0 | 0 | 0 |
| 25.06.2020 03:00 - 04:00 | 0 | 0 | 0 | 0 |
| 25.06.2020 04:00 - 05:00 | 0 | 0 | 0 | 0 |
| 25.06.2020 05:00 - 06:00 | 0 | 0 | 0 | 0 |
| 25.06.2020 06:00 - 07:00 | 0 | 0 | 0 | 0 |
| 25.06.2020 07:00 - 08:00 | 0 | 0 | 0 | 0 |
| 25.06.2020 08:00 - 09:00 | 0 | 0 | 0 | 0 |
| 25.06.2020 09:00 - 10:00 | 0 | 0 | 0 | 0 |
| 25.06.2020 10:00 - 11:00 | 0 | 0 | 0 | 0 |
| 25.06.2020 11:00 - 12:00 | 0 | 0 | 0 | 0 |
| 25.06.2020 12:00 - 13:00 | 0 | 0 | 0 | 0 |
| 25.06.2020 13:00 - 14:00 | 0 | 0 | 0 | 0 |
| 25.06.2020 14:00 - 15:00 | 0 | 0 | 0 | 0 |
| 25.06.2020 15:00 - 16:00 | 0 | 0 | 0 | 0 |
| 25.06.2020 16:00 - 17:00 | 0 | 0 | 0 | 0 |
| 25.06.2020 17:00 - 18:00 | 0 | 0 | 0 | 0 |
| 25.06.2020 18:00 - 19:00 | 0 | 0 | 0 | 0 |
| 25.06.2020 19:00 - 20:00 | 0 | 0 | 0 | 0 |
| 25.06.2020 20:00 - 21:00 | 0 | 0 | 0 | 0 |
| 25.06.2020 21:00 - 22:00 | 0 | 0 | 0 | 0 |
| 25.06.2020 22:00 - 23:00 | 0 | 0 | 0 | 0 |
| 25.06.2020 23:00 - 24:00 | 0 | 0 | 0 | 0 |
| 26.06.2020 00:00 - 01:00 | 0 | 0 | 0 | 0 |
| 26.06.2020 01:00 - 02:00 | 0 | 0 | 0 | 0 |
| 26.06.2020 02:00 - 03:00 | 0 | 0 | 0 | 0 |
| 26.06.2020 03:00 - 04:00 | 0 | 0 | 0 | 0 |
| 26.06.2020 04:00 - 05:00 | 0 | 0 | 0 | 0 |
| 26.06.2020 05:00 - 06:00 | 0 | 0 | 0 | 0 |
| 26.06.2020 06:00 - 07:00 | 0 | 0 | 0 | 0 |
| 26.06.2020 07:00 - 08:00 | 0 | 0 | 0 | 0 |
| 26.06.2020 08:00 - 09:00 | 0 | 0 | 0 | 0 |
| 26.06.2020 09:00 - 10:00 | 0 | 0 | 0 | 0 |
| 26.06.2020 10:00 - 11:00 | 0 | 0 | 0 | 0 |
| 26.06.2020 11:00 - 12:00 | 0 | 0 | 0 | 0 |
| 26.06.2020 12:00 - 13:00 | 0 | 0 | 0 | 0 |
| 26.06.2020 13:00 - 14:00 | 0 | 0 | 0 | 0 |
| 26.06.2020 14:00 - 15:00 | 0 | 0 | 0 | 0 |
| 26.06.2020 15:00 - 16:00 | 0 | 0 | 0 | 0 |
| 26.06.2020 16:00 - 17:00 | 0 | 0 | 0 | 0 |
| 26.06.2020 17:00 - 18:00 | 0 | 0 | 0 | 0 |
| 26.06.2020 18:00 - 19:00 | 0 | 0 | 0 | 0 |
| 26.06.2020 19:00 - 20:00 | 0 | 0 | 0 | 0 |
| 26.06.2020 20:00 - 21:00 | 0 | 0 | 0 | 0 |
| 26.06.2020 21:00 - 22:00 | 0 | 0 | 0 | 0 |
| 26.06.2020 22:00 - 23:00 | 0 | 0 | 0 | 0 |
| 26.06.2020 23:00 - 24:00 | 0 | 0 | 0 | 0 |
| 27.06.2020 00:00 - 01:00 | 0 | 0 | 0 | 0 |
| 27.06.2020 01:00 - 02:00 | 0 | 0 | 0 | 0 |
| 27.06.2020 02:00 - 03:00 | 0 | 0 | 0 | 0 |
| 27.06.2020 03:00 - 04:00 | 0 | 0 | 0 | 0 |
| 27.06.2020 04:00 - 05:00 | 0 | 0 | 0 | 0 |
| 27.06.2020 05:00 - 06:00 | 0 | 0 | 0 | 0 |
| 27.06.2020 06:00 - 07:00 | 0 | 0 | 0 | 0 |
| 27.06.2020 07:00 - 08:00 | 0 | 0 | 0 | 0 |
| 27.06.2020 08:00 - 09:00 | 0 | 0 | 0 | 0 |
| 27.06.2020 09:00 - 10:00 | 0 | 0 | 0 | 0 |
| 27.06.2020 10:00 - 11:00 | 0 | 0 | 0 | 0 |
| 27.06.2020 11:00 - 12:00 | 0 | 0 | 0 | 0 |
| 27.06.2020 12:00 - 13:00 | 0 | 0 | 0 | 0 |
| 27.06.2020 13:00 - 14:00 | 0 | 0 | 0 | 0 |
| 27.06.2020 14:00 - 15:00 | 0 | 0 | 0 | 0 |
| 27.06.2020 15:00 - 16:00 | 0 | 0 | 0 | 0 |
| 27.06.2020 16:00 - 17:00 | 0 | 0 | 0 | 0 |
| 27.06.2020 17:00 - 18:00 | 0 | 0 | 0 | 0 |
| 27.06.2020 18:00 - 19:00 | 0 | 0 | 0 | 0 |
| 27.06.2020 19:00 - 20:00 | 0 | 0 | 0 | 0 |
| 27.06.2020 20:00 - 21:00 | 0 | 0 | 0 | 0 |
| 27.06.2020 21:00 - 22:00 | 0 | 0 | 0 | 0 |
| 27.06.2020 22:00 - 23:00 | 0 | -40 | 0 | 0 |
| 27.06.2020 23:00 - 24:00 | 0 | -40 | 0 | 0 |
| 28.06.2020 00:00 - 01:00 | 0 | -80 | 0 | 0 |
| 28.06.2020 01:00 - 02:00 | 0 | -80 | 0 | 0 |
| 28.06.2020 02:00 - 03:00 | 0 | -80 | 0 | 0 |
| 28.06.2020 03:00 - 04:00 | 0 | -80 | 0 | 0 |
| 28.06.2020 04:00 - 05:00 | 0 | -80 | 0 | 0 |
| 28.06.2020 05:00 - 06:00 | 0 | -80 | 0 | 0 |
| 28.06.2020 06:00 - 07:00 | 0 | 0 | 0 | 0 |
| 28.06.2020 07:00 - 08:00 | 0 | 0 | 0 | 0 |
| 28.06.2020 08:00 - 09:00 | 0 | 0 | 0 | 0 |
| 28.06.2020 09:00 - 10:00 | 0 | 0 | 0 | 0 |
| 28.06.2020 10:00 - 11:00 | 0 | 0 | 0 | 0 |
| 28.06.2020 11:00 - 12:00 | 0 | 0 | 0 | 0 |
| 28.06.2020 12:00 - 13:00 | 0 | 0 | 0 | 0 |
| 28.06.2020 13:00 - 14:00 | 0 | 0 | 0 | 0 |
| 28.06.2020 14:00 - 15:00 | 0 | 0 | 0 | 0 |
| 28.06.2020 15:00 - 16:00 | 0 | 0 | 0 | 0 |
| 28.06.2020 16:00 - 17:00 | 0 | 0 | 0 | 0 |
| 28.06.2020 17:00 - 18:00 | 0 | 0 | 0 | 0 |
| 28.06.2020 18:00 - 19:00 | 0 | 0 | 0 | 0 |
| 28.06.2020 19:00 - 20:00 | 0 | 0 | 0 | 0 |
| 28.06.2020 20:00 - 21:00 | 0 | 0 | 0 | 0 |
| 28.06.2020 21:00 - 22:00 | 0 | 0 | 0 | 0 |
| 28.06.2020 22:00 - 23:00 | 0 | 0 | 0 | 0 |
| 28.06.2020 23:00 - 24:00 | 0 | 0 | 0 | 0 |
| 29.06.2020 00:00 - 01:00 | 0 | 0 | 0 | 0 |
| 29.06.2020 01:00 - 02:00 | 0 | 0 | 0 | 0 |
| 29.06.2020 02:00 - 03:00 | 0 | 0 | 0 | 0 |
| 29.06.2020 03:00 - 04:00 | 0 | 0 | 0 | 0 |
| 29.06.2020 04:00 - 05:00 | 0 | 0 | 0 | 0 |
| 29.06.2020 05:00 - 06:00 | 0 | 0 | 0 | 0 |
| 29.06.2020 06:00 - 07:00 | 0 | 0 | 0 | 0 |
| 29.06.2020 07:00 - 08:00 | 0 | 0 | 0 | 0 |
| 29.06.2020 08:00 - 09:00 | 0 | 0 | 0 | 0 |
| 29.06.2020 09:00 - 10:00 | 0 | 0 | 0 | 0 |
| 29.06.2020 10:00 - 11:00 | 0 | 0 | 0 | 0 |
| 29.06.2020 11:00 - 12:00 | 0 | 0 | 0 | 0 |
| 29.06.2020 12:00 - 13:00 | 0 | 0 | 0 | 0 |
| 29.06.2020 13:00 - 14:00 | 0 | 0 | 0 | 0 |
| 29.06.2020 14:00 - 15:00 | 0 | 0 | 0 | 0 |
| 29.06.2020 15:00 - 16:00 | 0 | 0 | 0 | 0 |
| 29.06.2020 16:00 - 17:00 | 0 | 0 | 0 | 0 |
| 29.06.2020 17:00 - 18:00 | 0 | 0 | 0 | 0 |
| 29.06.2020 18:00 - 19:00 | 0 | 0 | 0 | 0 |
| 29.06.2020 19:00 - 20:00 | 0 | 0 | 0 | 0 |
| 29.06.2020 20:00 - 21:00 | 0 | 0 | 0 | 0 |
| 29.06.2020 21:00 - 22:00 | 0 | 0 | 0 | 0 |
| 29.06.2020 22:00 - 23:00 | 0 | 0 | 0 | 0 |
| 29.06.2020 23:00 - 24:00 | 0 | 0 | 0 | 0 |
| 30.06.2020 00:00 - 01:00 | 0 | 0 | 0 | 0 |
| 30.06.2020 01:00 - 02:00 | 0 | 0 | 0 | 0 |
| 30.06.2020 02:00 - 03:00 | 0 | 0 | 0 | 0 |
| 30.06.2020 03:00 - 04:00 | 0 | 0 | 0 | 0 |
| 30.06.2020 04:00 - 05:00 | 0 | 0 | 0 | 0 |
| 30.06.2020 05:00 - 06:00 | 0 | 0 | 0 | 0 |
| 30.06.2020 06:00 - 07:00 | 0 | 0 | 0 | 0 |
| 30.06.2020 07:00 - 08:00 | 0 | 0 | 0 | 0 |
| 30.06.2020 08:00 - 09:00 | 0 | 0 | 0 | 0 |
| 30.06.2020 09:00 - 10:00 | 0 | 0 | 0 | 0 |
| 30.06.2020 10:00 - 11:00 | 0 | 0 | 0 | 0 |
| 30.06.2020 11:00 - 12:00 | 0 | 0 | 0 | 0 |